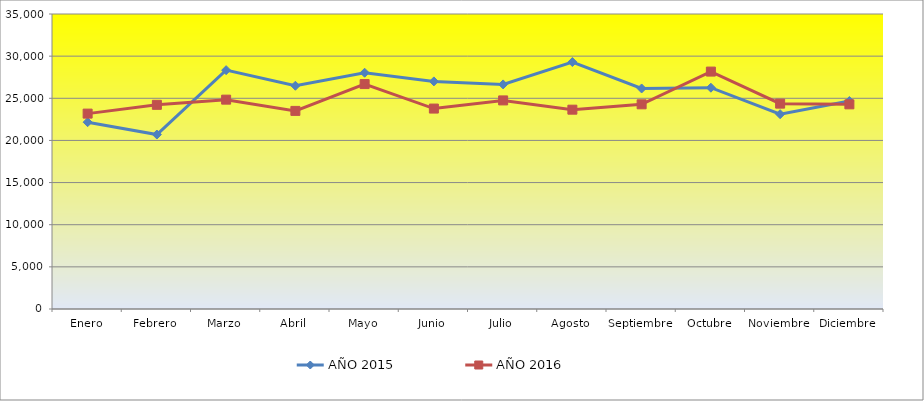
| Category | AÑO 2015 | AÑO 2016 |
|---|---|---|
| Enero | 22166 | 23181 |
| Febrero | 20699 | 24223 |
| Marzo | 28338 | 24838 |
| Abril | 26487 | 23504 |
| Mayo | 28031 | 26687 |
| Junio | 27003 | 23780 |
| Julio | 26646 | 24748 |
| Agosto | 29299 | 23649 |
| Septiembre | 26164 | 24284 |
| Octubre | 26254 | 28167 |
| Noviembre | 23113 | 24365 |
| Diciembre | 24671 | 24280 |